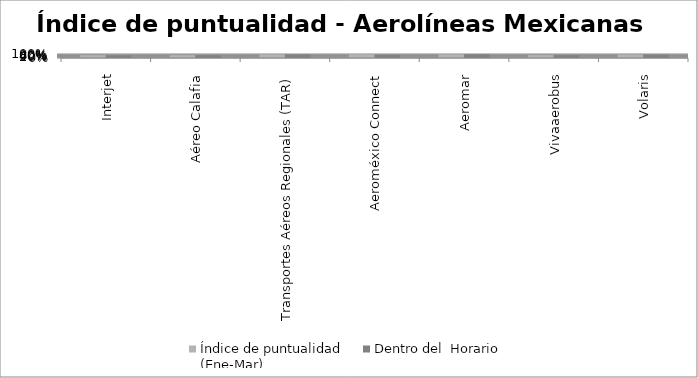
| Category | Índice de puntualidad
(Ene-Mar) | Dentro del  Horario |
|---|---|---|
| Interjet | 0.707 | 0.646 |
| Aéreo Calafia | 0.7 | 0.689 |
| Transportes Aéreos Regionales (TAR) | 0.888 | 0.888 |
| Aeroméxico Connect | 0.927 | 0.802 |
| Aeromar | 0.907 | 0.907 |
| Vivaaerobus | 0.728 | 0.717 |
| Volaris | 0.843 | 0.837 |